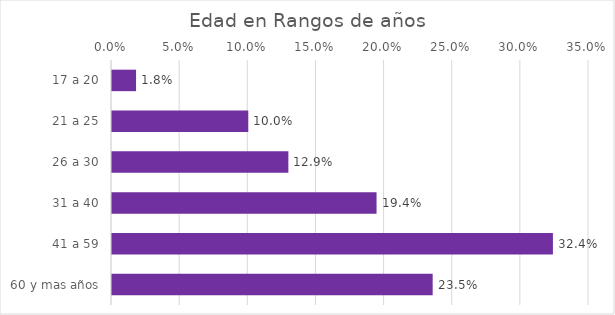
| Category | % del N de columna |
|---|---|
| 17 a 20 | 0.018 |
| 21 a 25 | 0.1 |
| 26 a 30 | 0.129 |
| 31 a 40 | 0.194 |
| 41 a 59 | 0.324 |
| 60 y mas años | 0.235 |